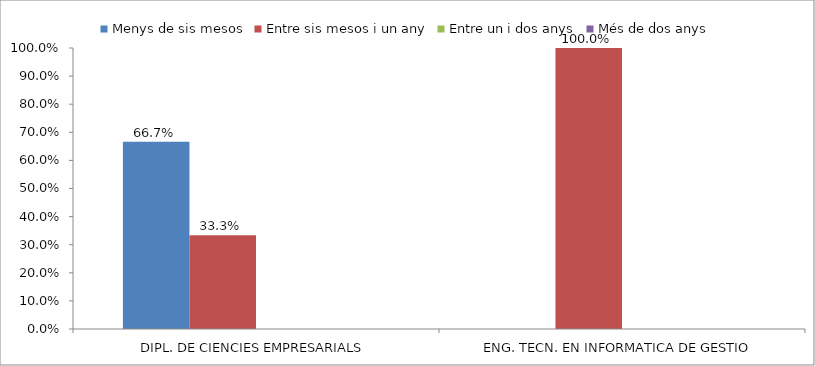
| Category | Menys de sis mesos | Entre sis mesos i un any | Entre un i dos anys | Més de dos anys |
|---|---|---|---|---|
| DIPL. DE CIENCIES EMPRESARIALS | 0.667 | 0.333 | 0 | 0 |
| ENG. TECN. EN INFORMATICA DE GESTIO | 0 | 1 | 0 | 0 |